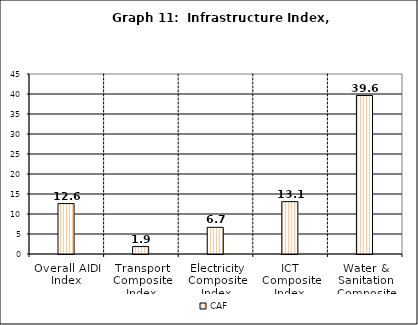
| Category | Series 0 | CAF | Series 2 |
|---|---|---|---|
| Overall AIDI Index |  | 12.603 |  |
| Transport Composite Index |  | 1.859 |  |
| Electricity Composite Index |  | 6.667 |  |
| ICT Composite Index  |  | 13.092 |  |
| Water & Sanitation Composite Index |  | 39.617 |  |